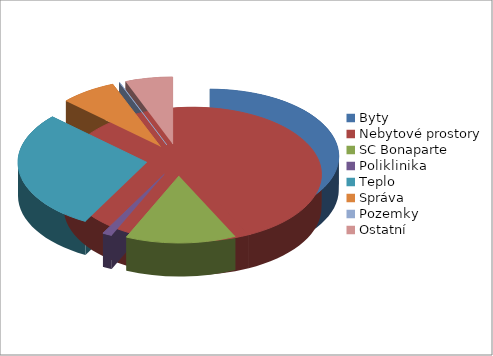
| Category | Series 0 |
|---|---|
| Byty | 1352559.46 |
| Nebytové prostory | -402.18 |
| SC Bonaparte | 438063.33 |
| Poliklinika | 38178 |
| Teplo | 915556.85 |
| Správa | 223250.34 |
| Pozemky | 2667.04 |
| Ostatní | 187705.4 |